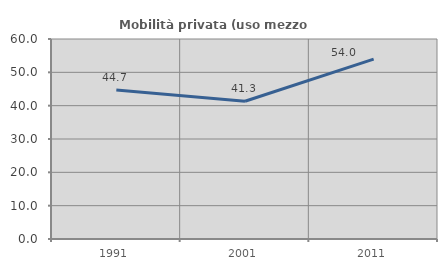
| Category | Mobilità privata (uso mezzo privato) |
|---|---|
| 1991.0 | 44.73 |
| 2001.0 | 41.311 |
| 2011.0 | 53.977 |